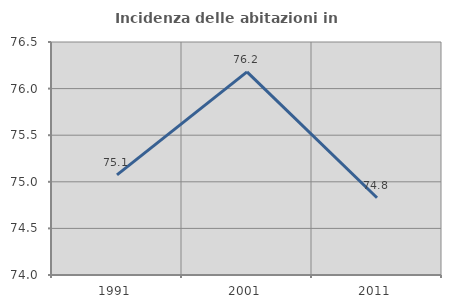
| Category | Incidenza delle abitazioni in proprietà  |
|---|---|
| 1991.0 | 75.075 |
| 2001.0 | 76.179 |
| 2011.0 | 74.828 |